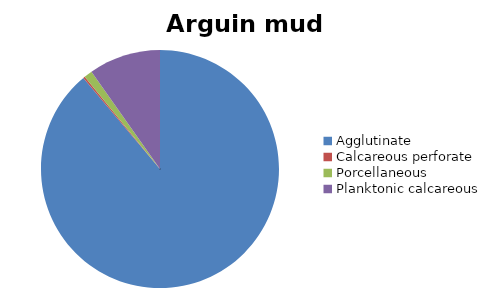
| Category | Arguin mud belt |
|---|---|
| ﻿Agglutinate | 88.866 |
| Calcareous perforate | 0.231 |
| Porcellaneous | 1.135 |
| Planktonic calcareous | 9.768 |